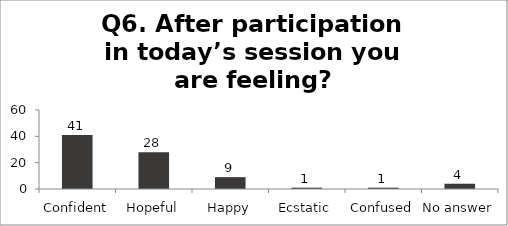
| Category | Q6. After participation in today’s session you are feeling? |
|---|---|
| Confident | 41 |
| Hopeful | 28 |
| Happy | 9 |
| Ecstatic | 1 |
| Confused | 1 |
| No answer | 4 |